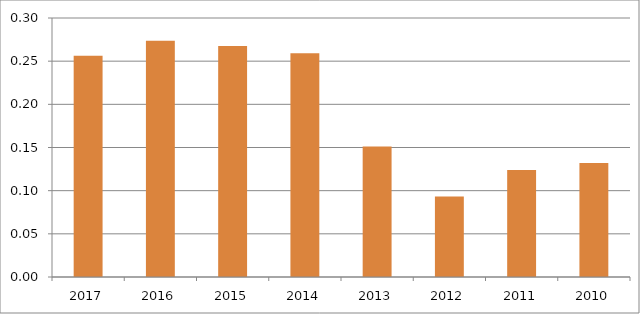
| Category | КОСОС |
|---|---|
| 2017.0 | 0.256 |
| 2016.0 | 0.274 |
| 2015.0 | 0.268 |
| 2014.0 | 0.259 |
| 2013.0 | 0.151 |
| 2012.0 | 0.093 |
| 2011.0 | 0.124 |
| 2010.0 | 0.132 |